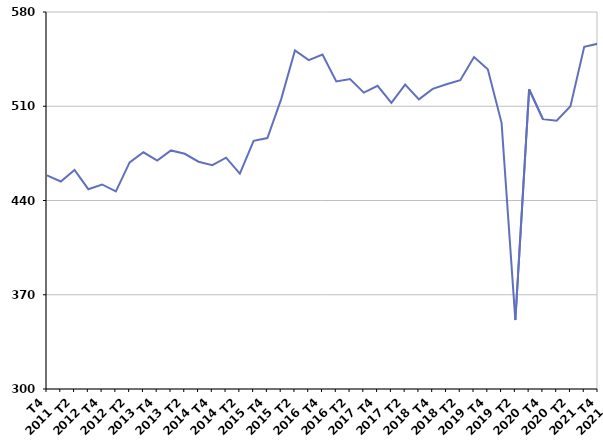
| Category | Ensemble des sorties de catégories A, B, C |
|---|---|
| T4
2011 | 458.6 |
| T1
2012 | 454.1 |
| T2
2012 | 462.7 |
| T3
2012 | 448.4 |
| T4
2012 | 451.9 |
| T1
2013 | 446.8 |
| T2
2013 | 468.3 |
| T3
2013 | 475.8 |
| T4
2013 | 469.6 |
| T1
2014 | 477.2 |
| T2
2014 | 474.7 |
| T3
2014 | 468.8 |
| T4
2014 | 466.2 |
| T1
2015 | 471.8 |
| T2
2015 | 459.9 |
| T3
2015 | 484.3 |
| T4
2015 | 486.4 |
| T1
2016 | 515.3 |
| T2
2016 | 551.5 |
| T3
2016 | 544.3 |
| T4
2016 | 548.4 |
| T1
2017 | 528.4 |
| T2
2017 | 530.2 |
| T3
2017 | 520.1 |
| T4
2017 | 525.2 |
| T1
2018 | 512.5 |
| T2
2018 | 526.1 |
| T3
2018 | 515.1 |
| T4
2018 | 522.9 |
| T1
2019 | 526.3 |
| T2
2019 | 529.3 |
| T3
2019 | 546.6 |
| T4
2019 | 537.5 |
| T1
2020 | 497.7 |
| T2
2020 | 351.2 |
| T3
2020 | 522.6 |
| T4
2020 | 500.4 |
| T1
2021 | 499.3 |
| T2
2021 | 510 |
| T3
2021 | 554.1 |
| T4
2021 | 556.5 |